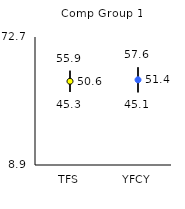
| Category | 25th | 75th | Mean |
|---|---|---|---|
| TFS | 45.3 | 55.9 | 50.63 |
| YFCY | 45.1 | 57.6 | 51.37 |